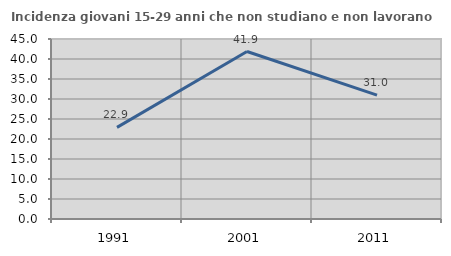
| Category | Incidenza giovani 15-29 anni che non studiano e non lavorano  |
|---|---|
| 1991.0 | 22.917 |
| 2001.0 | 41.875 |
| 2011.0 | 30.961 |